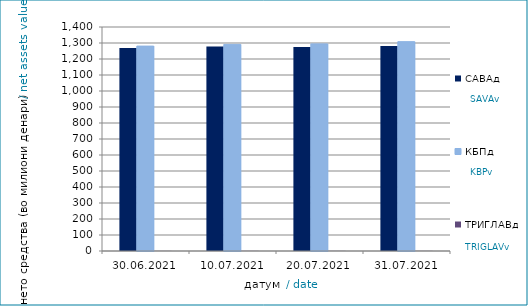
| Category | САВАд | КБПд | ТРИГЛАВд |
|---|---|---|---|
| 2021-06-30 | 1268.338 | 1280.65 | 0.718 |
| 2021-07-10 | 1277.685 | 1291.241 | 0.788 |
| 2021-07-20 | 1275.015 | 1294.498 | 0.86 |
| 2021-07-31 | 1280.636 | 1308.424 | 0.895 |